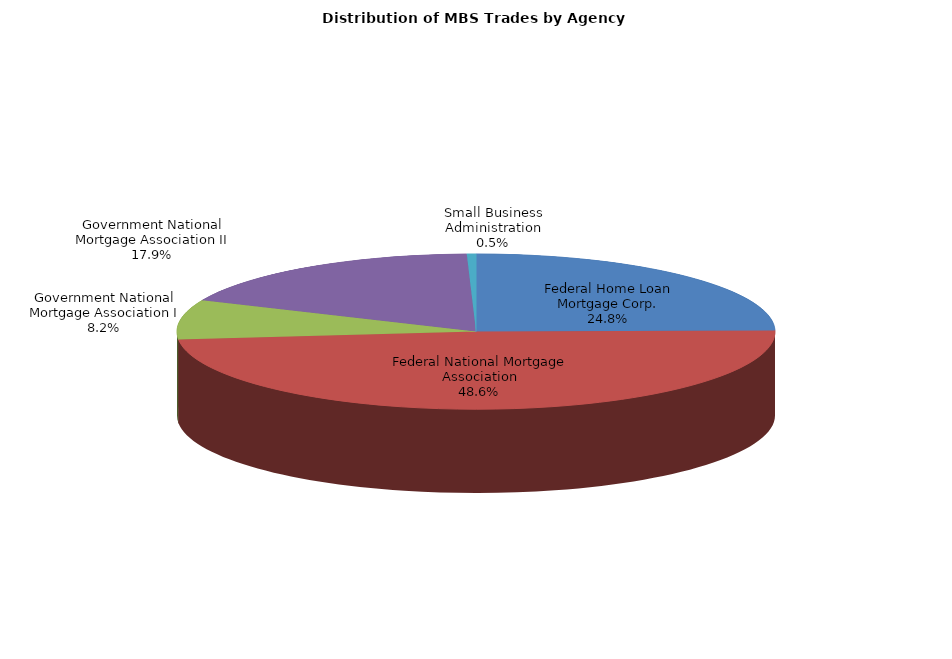
| Category | Series 0 |
|---|---|
| Federal Home Loan Mortgage Corp. | 804 |
| Federal National Mortgage Association | 1580 |
| Government National Mortgage Association I | 267 |
| Government National Mortgage Association II | 581 |
| Small Business Administration | 16 |